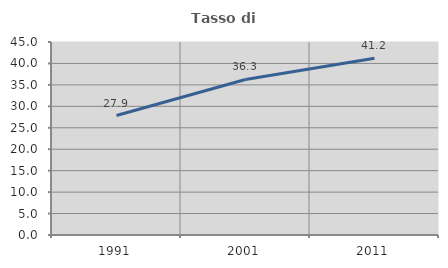
| Category | Tasso di occupazione   |
|---|---|
| 1991.0 | 27.858 |
| 2001.0 | 36.259 |
| 2011.0 | 41.231 |